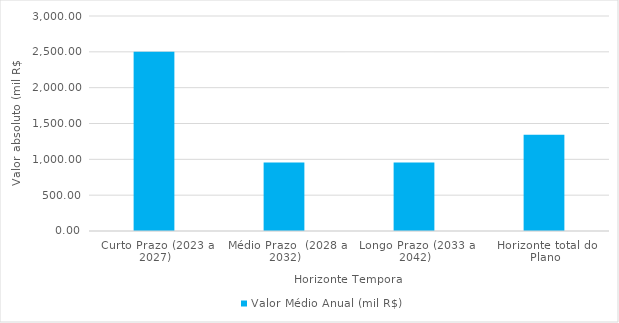
| Category | Valor Médio Anual (mil R$) |
|---|---|
| Curto Prazo (2023 a 2027) | 2502.454 |
| Médio Prazo  (2028 a 2032) | 955.358 |
| Longo Prazo (2033 a 2042) | 957.082 |
| Horizonte total do Plano | 1342.994 |